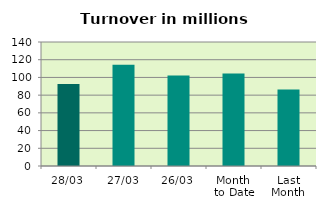
| Category | Series 0 |
|---|---|
| 28/03 | 92.555 |
| 27/03 | 114.358 |
| 26/03 | 102.228 |
| Month 
to Date | 104.503 |
| Last
Month | 86.247 |